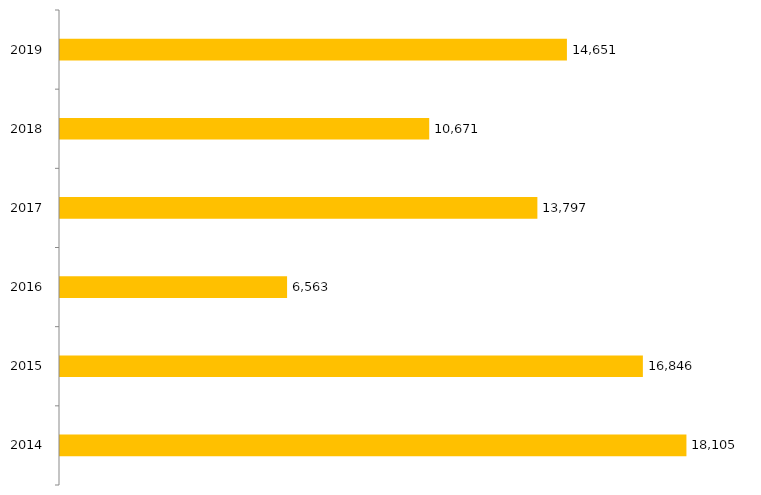
| Category | Inscritos |
|---|---|
| 2014.0 | 18105 |
| 2015.0 | 16846 |
| 2016.0 | 6563 |
| 2017.0 | 13797 |
| 2018.0 | 10671 |
| 2019.0 | 14651 |